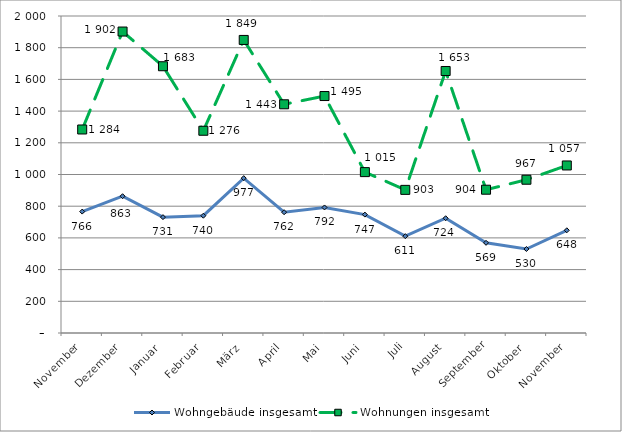
| Category | Wohngebäude insgesamt | Wohnungen insgesamt |
|---|---|---|
| November | 766 | 1284 |
| Dezember | 863 | 1902 |
| Januar | 731 | 1683 |
| Februar | 740 | 1276 |
| März | 977 | 1849 |
| April | 762 | 1443 |
| Mai | 792 | 1495 |
| Juni | 747 | 1015 |
| Juli | 611 | 903 |
| August | 724 | 1653 |
| September | 569 | 904 |
| Oktober | 530 | 967 |
| November | 648 | 1057 |